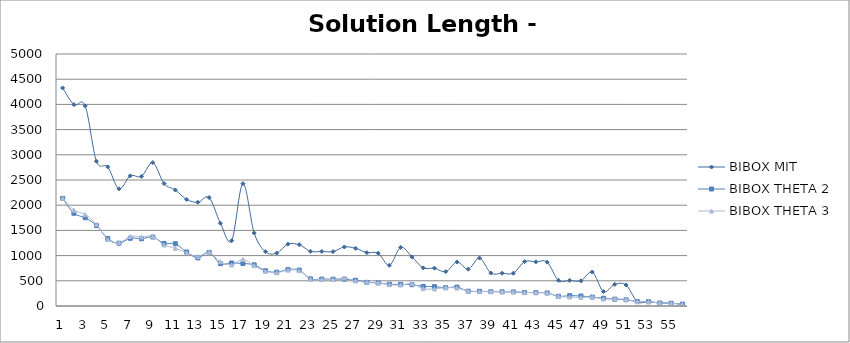
| Category | BIBOX MIT | BIBOX THETA 2 | BIBOX THETA 3 |
|---|---|---|---|
| 1.0 | 4327 | 2135 | 2137 |
| 2.0 | 3996 | 1840 | 1902 |
| 3.0 | 3971 | 1751 | 1815 |
| 4.0 | 2873 | 1597 | 1621 |
| 5.0 | 2760 | 1339 | 1319 |
| 6.0 | 2324 | 1245 | 1255 |
| 7.0 | 2582 | 1344 | 1380 |
| 8.0 | 2572 | 1334 | 1370 |
| 9.0 | 2845 | 1368 | 1380 |
| 10.0 | 2430 | 1241 | 1210 |
| 11.0 | 2302 | 1235 | 1145 |
| 12.0 | 2116 | 1072 | 1058 |
| 13.0 | 2057 | 955 | 983 |
| 14.0 | 2151 | 1063 | 1065 |
| 15.0 | 1643 | 841 | 879 |
| 16.0 | 1296 | 853 | 814 |
| 17.0 | 2428 | 843 | 923 |
| 18.0 | 1448 | 816 | 800 |
| 19.0 | 1078 | 699 | 691 |
| 20.0 | 1050 | 671 | 663 |
| 21.0 | 1227 | 723 | 712 |
| 22.0 | 1216 | 712 | 701 |
| 23.0 | 1085 | 538 | 531 |
| 24.0 | 1082 | 535 | 528 |
| 25.0 | 1079 | 532 | 525 |
| 26.0 | 1172 | 533 | 554 |
| 27.0 | 1144 | 510 | 498 |
| 28.0 | 1059 | 469 | 474 |
| 29.0 | 1048 | 458 | 463 |
| 30.0 | 807 | 432 | 423 |
| 31.0 | 1163 | 428 | 416 |
| 32.0 | 975 | 423 | 440 |
| 33.0 | 756 | 389 | 344 |
| 34.0 | 750 | 383 | 338 |
| 35.0 | 682 | 363 | 365 |
| 36.0 | 872 | 375 | 356 |
| 37.0 | 730 | 294 | 298 |
| 38.0 | 951 | 292 | 285 |
| 39.0 | 654 | 284 | 290 |
| 40.0 | 651 | 281 | 287 |
| 41.0 | 650 | 280 | 286 |
| 42.0 | 880 | 268 | 270 |
| 43.0 | 876 | 264 | 266 |
| 44.0 | 870 | 258 | 260 |
| 45.0 | 509 | 192 | 193 |
| 46.0 | 507 | 205 | 178 |
| 47.0 | 500 | 198 | 171 |
| 48.0 | 674 | 176 | 176 |
| 49.0 | 287 | 154 | 138 |
| 50.0 | 429 | 135 | 143 |
| 51.0 | 417 | 123 | 131 |
| 52.0 | 87 | 87 | 87 |
| 53.0 | 85 | 85 | 85 |
| 54.0 | 59 | 59 | 59 |
| 55.0 | 54 | 54 | 54 |
| 56.0 | 37 | 37 | 37 |